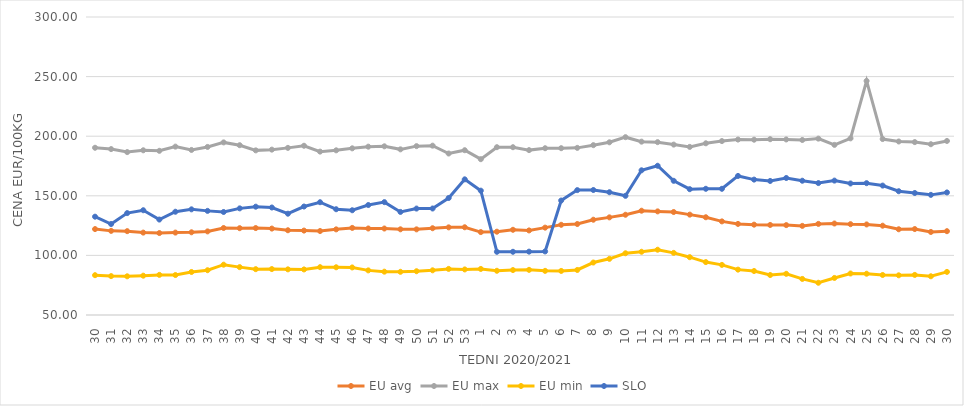
| Category | EU avg | EU max | EU min | SLO |
|---|---|---|---|---|
| 30.0 | 122.086 | 190.31 | 83.4 | 132.48 |
| 31.0 | 120.581 | 189.19 | 82.63 | 126.34 |
| 32.0 | 120.341 | 186.67 | 82.46 | 135.48 |
| 33.0 | 119.127 | 188.18 | 82.99 | 137.89 |
| 34.0 | 118.75 | 187.74 | 83.66 | 130.07 |
| 35.0 | 119.136 | 191.25 | 83.53 | 136.63 |
| 36.0 | 119.398 | 188.47 | 86.09 | 138.64 |
| 37.0 | 120.135 | 190.99 | 87.57 | 137.35 |
| 38.0 | 122.982 | 194.8 | 92.21 | 136.42 |
| 39.0 | 122.832 | 192.45 | 90.16 | 139.46 |
| 40.0 | 122.936 | 188.11 | 88.45 | 140.87 |
| 41.0 | 122.507 | 188.73 | 88.54 | 140.18 |
| 42.0 | 121.098 | 190.2 | 88.3 | 134.98 |
| 43.0 | 120.822 | 191.99 | 88.22 | 141 |
| 44.0 | 120.448 | 187.06 | 90.13 | 144.61 |
| 45.0 | 121.843 | 188.15 | 90.04 | 138.73 |
| 46.0 | 123.07 | 189.82 | 89.89 | 137.88 |
| 47.0 | 122.58 | 191.22 | 87.43 | 142.27 |
| 48.0 | 122.553 | 191.52 | 86.35 | 144.69 |
| 49.0 | 121.893 | 188.97 | 86.24 | 136.47 |
| 50.0 | 121.851 | 191.67 | 86.72 | 139.29 |
| 51.0 | 122.8 | 192.06 | 87.5 | 139.35 |
| 52.0 | 123.52 | 185.468 | 88.67 | 148.16 |
| 53.0 | 123.611 | 188.25 | 88.23 | 163.81 |
| 1.0 | 119.553 | 180.72 | 88.64 | 154.31 |
| 2.0 | 119.893 | 190.77 | 87.1 | 103.02 |
| 3.0 | 121.489 | 190.76 | 87.7 | 103.03 |
| 4.0 | 120.954 | 188.33 | 87.88 | 103.15 |
| 5.0 | 123.293 | 189.91 | 87.04 | 103.34 |
| 6.0 | 125.679 | 189.94 | 86.97 | 146.03 |
| 7.0 | 126.33 | 190.21 | 87.79 | 154.77 |
| 8.0 | 129.933 | 192.48 | 94.02 | 154.86 |
| 9.0 | 131.908 | 194.884 | 97.12 | 153 |
| 10.0 | 134.098 | 199.17 | 101.79 | 149.98 |
| 11.0 | 137.49 | 195.419 | 103.05 | 171.4 |
| 12.0 | 136.929 | 195.013 | 104.76 | 175.2 |
| 13.0 | 136.39 | 192.952 | 102.11 | 162.57 |
| 14.0 | 134.198 | 191.034 | 98.5 | 155.55 |
| 15.0 | 132.003 | 194.047 | 94.39 | 155.88 |
| 16.0 | 128.53 | 195.913 | 92.04 | 155.88 |
| 17.0 | 126.415 | 197.188 | 88.07 | 166.66 |
| 18.0 | 125.787 | 197.055 | 86.89 | 163.58 |
| 19.0 | 125.54 | 197.478 | 83.546 | 162.44 |
| 20.0 | 125.412 | 197.263 | 84.55 | 164.94 |
| 21.0 | 124.768 | 196.821 | 80.264 | 162.64 |
| 22.0 | 126.43 | 197.963 | 77.048 | 160.68 |
| 23.0 | 126.76 | 192.72 | 81.087 | 162.75 |
| 24.0 | 126.19 | 198.186 | 84.83 | 160.34 |
| 25.0 | 125.97 | 246.36 | 84.63 | 160.6 |
| 26.0 | 124.92 | 197.607 | 83.57 | 158.57 |
| 27.0 | 121.922 | 195.566 | 83.3 | 153.83 |
| 28.0 | 122.106 | 195.043 | 83.64 | 152.35 |
| 29.0 | 119.659 | 193.272 | 82.49 | 150.79 |
| 30.0 | 120.317 | 196.01 | 86.16 | 152.82 |